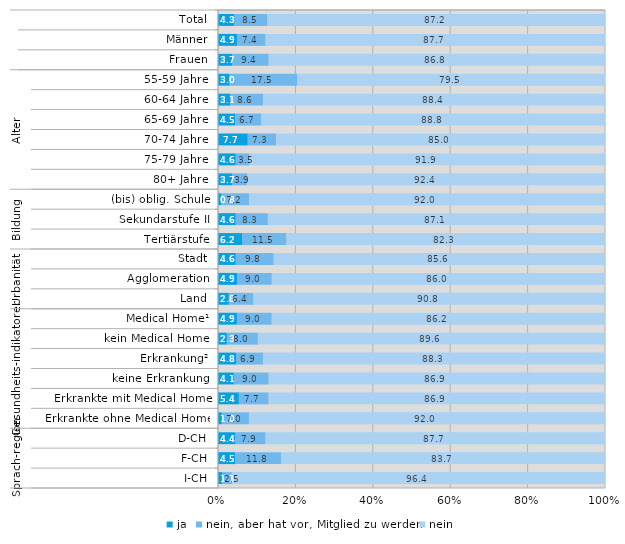
| Category | ja | nein, aber hat vor, Mitglied zu werden | nein |
|---|---|---|---|
| 0 | 4.3 | 8.5 | 87.2 |
| 1 | 4.9 | 7.4 | 87.7 |
| 2 | 3.7 | 9.4 | 86.8 |
| 3 | 3 | 17.5 | 79.5 |
| 4 | 3.1 | 8.6 | 88.4 |
| 5 | 4.5 | 6.7 | 88.8 |
| 6 | 7.7 | 7.3 | 85 |
| 7 | 4.6 | 3.5 | 91.9 |
| 8 | 3.7 | 3.9 | 92.4 |
| 9 | 0.8 | 7.2 | 92 |
| 10 | 4.6 | 8.3 | 87.1 |
| 11 | 6.2 | 11.5 | 82.3 |
| 12 | 4.6 | 9.8 | 85.6 |
| 13 | 4.9 | 9 | 86 |
| 14 | 2.8 | 6.4 | 90.8 |
| 15 | 4.9 | 9 | 86.2 |
| 16 | 2.3 | 8 | 89.6 |
| 17 | 4.8 | 6.9 | 88.3 |
| 18 | 4.1 | 9 | 86.9 |
| 19 | 5.4 | 7.7 | 86.9 |
| 20 | 1 | 7 | 92 |
| 21 | 4.4 | 7.9 | 87.7 |
| 22 | 4.5 | 11.8 | 83.7 |
| 23 | 1.1 | 2.5 | 96.4 |